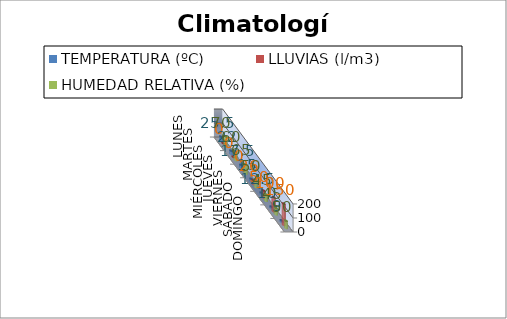
| Category | TEMPERATURA (ºC) | LLUVIAS (l/m3) | HUMEDAD RELATIVA (%) |
|---|---|---|---|
| LUNES | 25.5 | 0 | 70 |
| MARTES | 22 | 0 | 60 |
| MIÉRCOLES | 17.5 | 0 | 65 |
| JUEVES | 15 | 26 | 50 |
| VIERNES | 12.5 | 50 | 45 |
| SÁBADO | 10 | 100 | 45 |
| DOMINGO | 9 | 150 | 50 |